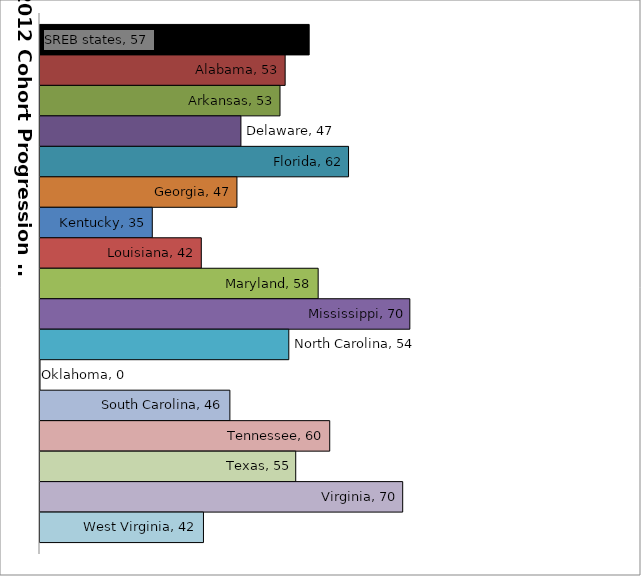
| Category | SREB states | Alabama | Arkansas | Delaware | Florida | Georgia | Kentucky | Louisiana | Maryland | Mississippi | North Carolina | Oklahoma | South Carolina | Tennessee | Texas | Virginia | West Virginia |
|---|---|---|---|---|---|---|---|---|---|---|---|---|---|---|---|---|---|
| 0 | 56.747 | 53.468 | 52.766 | 47.428 | 62.121 | 46.887 | 35.33 | 42.021 | 57.975 | 70.49 | 53.967 | 0 | 45.923 | 59.552 | 54.912 | 69.515 | 42.316 |